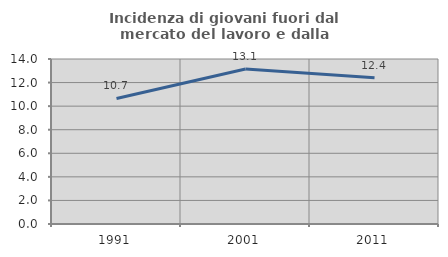
| Category | Incidenza di giovani fuori dal mercato del lavoro e dalla formazione  |
|---|---|
| 1991.0 | 10.651 |
| 2001.0 | 13.147 |
| 2011.0 | 12.406 |